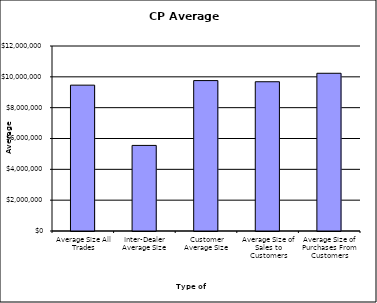
| Category | Security Type |
|---|---|
| Average Size All Trades | 9460732.394 |
| Inter-Dealer Average Size | 5551881.818 |
| Customer Average Size | 9756857.438 |
| Average Size of Sales to Customers | 9681648.045 |
| Average Size of Purchases From Customers | 10230412.06 |